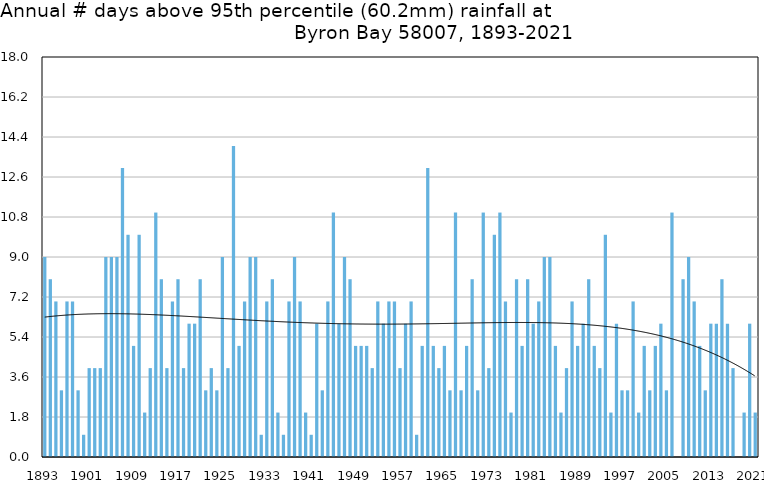
| Category | Annual # days above 95th percentile |
|---|---|
| 1893 | 9 |
| 1894 | 8 |
| 1895 | 7 |
| 1896 | 3 |
| 1897 | 7 |
| 1898 | 7 |
| 1899 | 3 |
| 1900 | 1 |
| 1901 | 4 |
| 1902 | 4 |
| 1903 | 4 |
| 1904 | 9 |
| 1905 | 9 |
| 1906 | 9 |
| 1907 | 13 |
| 1908 | 10 |
| 1909 | 5 |
| 1910 | 10 |
| 1911 | 2 |
| 1912 | 4 |
| 1913 | 11 |
| 1914 | 8 |
| 1915 | 4 |
| 1916 | 7 |
| 1917 | 8 |
| 1918 | 4 |
| 1919 | 6 |
| 1920 | 6 |
| 1921 | 8 |
| 1922 | 3 |
| 1923 | 4 |
| 1924 | 3 |
| 1925 | 9 |
| 1926 | 4 |
| 1927 | 14 |
| 1928 | 5 |
| 1929 | 7 |
| 1930 | 9 |
| 1931 | 9 |
| 1932 | 1 |
| 1933 | 7 |
| 1934 | 8 |
| 1935 | 2 |
| 1936 | 1 |
| 1937 | 7 |
| 1938 | 9 |
| 1939 | 7 |
| 1940 | 2 |
| 1941 | 1 |
| 1942 | 6 |
| 1943 | 3 |
| 1944 | 7 |
| 1945 | 11 |
| 1946 | 6 |
| 1947 | 9 |
| 1948 | 8 |
| 1949 | 5 |
| 1950 | 5 |
| 1951 | 5 |
| 1952 | 4 |
| 1953 | 7 |
| 1954 | 6 |
| 1955 | 7 |
| 1956 | 7 |
| 1957 | 4 |
| 1958 | 6 |
| 1959 | 7 |
| 1960 | 1 |
| 1961 | 5 |
| 1962 | 13 |
| 1963 | 5 |
| 1964 | 4 |
| 1965 | 5 |
| 1966 | 3 |
| 1967 | 11 |
| 1968 | 3 |
| 1969 | 5 |
| 1970 | 8 |
| 1971 | 3 |
| 1972 | 11 |
| 1973 | 4 |
| 1974 | 10 |
| 1975 | 11 |
| 1976 | 7 |
| 1977 | 2 |
| 1978 | 8 |
| 1979 | 5 |
| 1980 | 8 |
| 1981 | 6 |
| 1982 | 7 |
| 1983 | 9 |
| 1984 | 9 |
| 1985 | 5 |
| 1986 | 2 |
| 1987 | 4 |
| 1988 | 7 |
| 1989 | 5 |
| 1990 | 6 |
| 1991 | 8 |
| 1992 | 5 |
| 1993 | 4 |
| 1994 | 10 |
| 1995 | 2 |
| 1996 | 6 |
| 1997 | 3 |
| 1998 | 3 |
| 1999 | 7 |
| 2000 | 2 |
| 2001 | 5 |
| 2002 | 3 |
| 2003 | 5 |
| 2004 | 6 |
| 2005 | 3 |
| 2006 | 11 |
| 2007 | 0 |
| 2008 | 8 |
| 2009 | 9 |
| 2010 | 7 |
| 2011 | 5 |
| 2012 | 3 |
| 2013 | 6 |
| 2014 | 6 |
| 2015 | 8 |
| 2016 | 6 |
| 2017 | 4 |
| 2018 | 0 |
| 2019 | 2 |
| 2020 | 6 |
| 2021 | 2 |